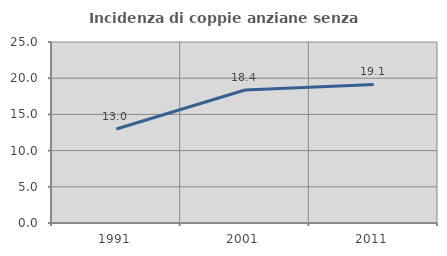
| Category | Incidenza di coppie anziane senza figli  |
|---|---|
| 1991.0 | 12.991 |
| 2001.0 | 18.373 |
| 2011.0 | 19.142 |